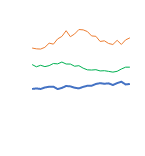
| Category | Item1 | Item2 | Item3 |
|---|---|---|---|
| 0 | 6361 | 4057 | 7923 |
| 1 | 6152 | 4110 | 7846 |
| 2 | 6293 | 4059 | 7824 |
| 3 | 6168 | 4200 | 7990 |
| 4 | 6259 | 4268 | 8382 |
| 5 | 6460 | 4278 | 8290 |
| 6 | 6427 | 4050 | 8782 |
| 7 | 6600 | 4158 | 9018 |
| 8 | 6415 | 4340 | 9557 |
| 9 | 6410 | 4303 | 8989 |
| 10 | 6205 | 4177 | 9250 |
| 11 | 6256 | 4114 | 9666 |
| 12 | 6024 | 4257 | 9636 |
| 13 | 5864 | 4361 | 9476 |
| 14 | 5846 | 4363 | 9063 |
| 15 | 5878 | 4530 | 9026 |
| 16 | 5762 | 4608 | 8541 |
| 17 | 5782 | 4551 | 8602 |
| 18 | 5719 | 4589 | 8350 |
| 19 | 5649 | 4432 | 8255 |
| 20 | 5724 | 4612 | 8648 |
| 21 | 5942 | 4742 | 8258 |
| 22 | 6117 | 4485 | 8691 |
| 23 | 6117 | 4533 | 8882 |